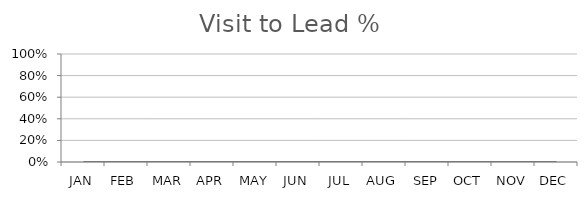
| Category | Visit to Lead % |
|---|---|
| JAN | 0 |
| FEB | 0 |
| MAR | 0 |
| APR | 0 |
| MAY | 0 |
| JUN | 0 |
| JUL | 0 |
| AUG | 0 |
| SEP | 0 |
| OCT | 0 |
| NOV | 0 |
| DEC | 0 |